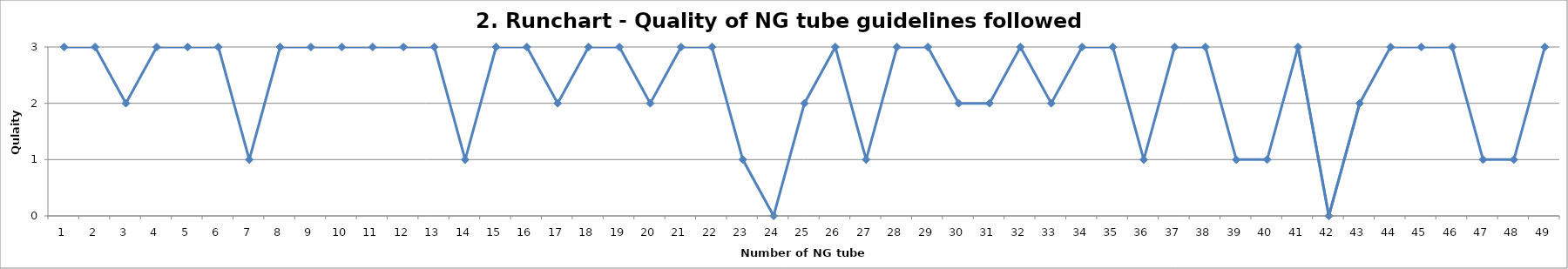
| Category | Series 0 |
|---|---|
| 0 | 3 |
| 1 | 3 |
| 2 | 2 |
| 3 | 3 |
| 4 | 3 |
| 5 | 3 |
| 6 | 1 |
| 7 | 3 |
| 8 | 3 |
| 9 | 3 |
| 10 | 3 |
| 11 | 3 |
| 12 | 3 |
| 13 | 1 |
| 14 | 3 |
| 15 | 3 |
| 16 | 2 |
| 17 | 3 |
| 18 | 3 |
| 19 | 2 |
| 20 | 3 |
| 21 | 3 |
| 22 | 1 |
| 23 | 0 |
| 24 | 2 |
| 25 | 3 |
| 26 | 1 |
| 27 | 3 |
| 28 | 3 |
| 29 | 2 |
| 30 | 2 |
| 31 | 3 |
| 32 | 2 |
| 33 | 3 |
| 34 | 3 |
| 35 | 1 |
| 36 | 3 |
| 37 | 3 |
| 38 | 1 |
| 39 | 1 |
| 40 | 3 |
| 41 | 0 |
| 42 | 2 |
| 43 | 3 |
| 44 | 3 |
| 45 | 3 |
| 46 | 1 |
| 47 | 1 |
| 48 | 3 |